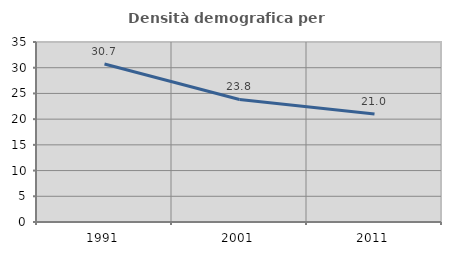
| Category | Densità demografica |
|---|---|
| 1991.0 | 30.732 |
| 2001.0 | 23.831 |
| 2011.0 | 20.977 |